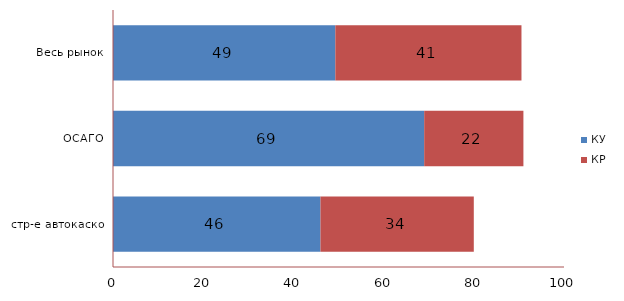
| Category | КУ | КР |
|---|---|---|
| стр-е автокаско | 46 | 34 |
| ОСАГО | 69 | 22 |
| Весь рынок | 49.296 | 41.274 |